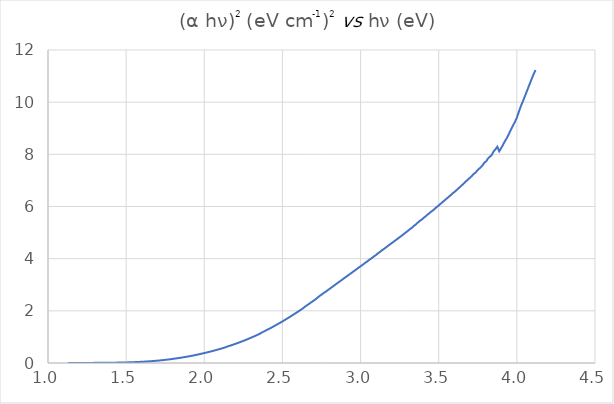
| Category | Series 0 |
|---|---|
| 1.12727 | 0.002 |
| 1.1283 | 0.002 |
| 1.12933 | 0.002 |
| 1.13036 | 0.002 |
| 1.13139 | 0.002 |
| 1.13242 | 0.002 |
| 1.13346 | 0.002 |
| 1.13449 | 0.002 |
| 1.13553 | 0.002 |
| 1.13657 | 0.002 |
| 1.13761 | 0.002 |
| 1.13866 | 0.002 |
| 1.13971 | 0.002 |
| 1.14075 | 0.002 |
| 1.1418 | 0.002 |
| 1.14286 | 0.002 |
| 1.14391 | 0.002 |
| 1.14497 | 0.002 |
| 1.14603 | 0.002 |
| 1.14709 | 0.002 |
| 1.14815 | 0.002 |
| 1.14921 | 0.002 |
| 1.15028 | 0.002 |
| 1.15135 | 0.002 |
| 1.15242 | 0.002 |
| 1.15349 | 0.002 |
| 1.15456 | 0.002 |
| 1.15564 | 0.002 |
| 1.15672 | 0.002 |
| 1.1578 | 0.002 |
| 1.15888 | 0.002 |
| 1.15996 | 0.002 |
| 1.16105 | 0.002 |
| 1.16214 | 0.002 |
| 1.16323 | 0.002 |
| 1.16432 | 0.002 |
| 1.16541 | 0.002 |
| 1.16651 | 0.002 |
| 1.16761 | 0.002 |
| 1.16871 | 0.002 |
| 1.16981 | 0.002 |
| 1.17092 | 0.002 |
| 1.17202 | 0.002 |
| 1.17313 | 0.002 |
| 1.17424 | 0.002 |
| 1.17536 | 0.002 |
| 1.17647 | 0.002 |
| 1.17759 | 0.002 |
| 1.17871 | 0.002 |
| 1.17983 | 0.002 |
| 1.18095 | 0.002 |
| 1.18208 | 0.002 |
| 1.18321 | 0.002 |
| 1.18434 | 0.002 |
| 1.18547 | 0.002 |
| 1.1866 | 0.002 |
| 1.18774 | 0.003 |
| 1.18888 | 0.003 |
| 1.19002 | 0.003 |
| 1.19116 | 0.003 |
| 1.19231 | 0.003 |
| 1.19346 | 0.003 |
| 1.19461 | 0.003 |
| 1.19576 | 0.003 |
| 1.19691 | 0.003 |
| 1.19807 | 0.003 |
| 1.19923 | 0.003 |
| 1.20039 | 0.003 |
| 1.20155 | 0.003 |
| 1.20272 | 0.003 |
| 1.20388 | 0.003 |
| 1.20505 | 0.003 |
| 1.20623 | 0.003 |
| 1.2074 | 0.003 |
| 1.20858 | 0.003 |
| 1.20976 | 0.003 |
| 1.21094 | 0.003 |
| 1.21212 | 0.003 |
| 1.21331 | 0.003 |
| 1.2145 | 0.003 |
| 1.21569 | 0.003 |
| 1.21688 | 0.003 |
| 1.21807 | 0.003 |
| 1.21927 | 0.003 |
| 1.22047 | 0.003 |
| 1.22167 | 0.003 |
| 1.22288 | 0.003 |
| 1.22409 | 0.003 |
| 1.2253 | 0.003 |
| 1.22651 | 0.003 |
| 1.22772 | 0.003 |
| 1.22894 | 0.003 |
| 1.23016 | 0.003 |
| 1.23138 | 0.003 |
| 1.2326 | 0.003 |
| 1.23383 | 0.003 |
| 1.23506 | 0.003 |
| 1.23629 | 0.003 |
| 1.23752 | 0.003 |
| 1.23876 | 0.003 |
| 1.24 | 0.003 |
| 1.24124 | 0.003 |
| 1.24248 | 0.003 |
| 1.24373 | 0.004 |
| 1.24498 | 0.004 |
| 1.24623 | 0.004 |
| 1.24748 | 0.004 |
| 1.24874 | 0.004 |
| 1.25 | 0.004 |
| 1.25126 | 0.004 |
| 1.25253 | 0.004 |
| 1.25379 | 0.004 |
| 1.25506 | 0.004 |
| 1.25633 | 0.004 |
| 1.25761 | 0.004 |
| 1.25888 | 0.004 |
| 1.26016 | 0.004 |
| 1.26144 | 0.004 |
| 1.26273 | 0.004 |
| 1.26402 | 0.004 |
| 1.26531 | 0.004 |
| 1.2666 | 0.004 |
| 1.26789 | 0.004 |
| 1.26919 | 0.004 |
| 1.27049 | 0.004 |
| 1.27179 | 0.004 |
| 1.2731 | 0.004 |
| 1.27441 | 0.004 |
| 1.27572 | 0.004 |
| 1.27703 | 0.004 |
| 1.27835 | 0.004 |
| 1.27967 | 0.004 |
| 1.28099 | 0.004 |
| 1.28232 | 0.004 |
| 1.28364 | 0.004 |
| 1.28497 | 0.005 |
| 1.28631 | 0.005 |
| 1.28764 | 0.005 |
| 1.28898 | 0.005 |
| 1.29032 | 0.005 |
| 1.29167 | 0.005 |
| 1.29301 | 0.005 |
| 1.29436 | 0.005 |
| 1.29572 | 0.005 |
| 1.29707 | 0.005 |
| 1.29843 | 0.005 |
| 1.29979 | 0.005 |
| 1.30115 | 0.005 |
| 1.30252 | 0.005 |
| 1.30389 | 0.005 |
| 1.30526 | 0.005 |
| 1.30664 | 0.005 |
| 1.30802 | 0.005 |
| 1.3094 | 0.005 |
| 1.31078 | 0.005 |
| 1.31217 | 0.005 |
| 1.31356 | 0.006 |
| 1.31495 | 0.006 |
| 1.31635 | 0.006 |
| 1.31775 | 0.006 |
| 1.31915 | 0.006 |
| 1.32055 | 0.006 |
| 1.32196 | 0.006 |
| 1.32337 | 0.006 |
| 1.32479 | 0.006 |
| 1.3262 | 0.006 |
| 1.32762 | 0.006 |
| 1.32905 | 0.006 |
| 1.33047 | 0.006 |
| 1.3319 | 0.006 |
| 1.33333 | 0.006 |
| 1.33477 | 0.006 |
| 1.33621 | 0.006 |
| 1.33765 | 0.007 |
| 1.33909 | 0.007 |
| 1.34054 | 0.007 |
| 1.34199 | 0.007 |
| 1.34345 | 0.007 |
| 1.3449 | 0.007 |
| 1.34636 | 0.007 |
| 1.34783 | 0.007 |
| 1.34929 | 0.007 |
| 1.35076 | 0.007 |
| 1.35224 | 0.007 |
| 1.35371 | 0.007 |
| 1.35519 | 0.007 |
| 1.35667 | 0.008 |
| 1.35816 | 0.008 |
| 1.35965 | 0.008 |
| 1.36114 | 0.008 |
| 1.36264 | 0.008 |
| 1.36414 | 0.008 |
| 1.36564 | 0.008 |
| 1.36714 | 0.008 |
| 1.36865 | 0.008 |
| 1.37017 | 0.008 |
| 1.37168 | 0.008 |
| 1.3732 | 0.008 |
| 1.37472 | 0.009 |
| 1.37625 | 0.009 |
| 1.37778 | 0.009 |
| 1.37931 | 0.009 |
| 1.38085 | 0.009 |
| 1.38239 | 0.009 |
| 1.38393 | 0.009 |
| 1.38547 | 0.009 |
| 1.38702 | 0.009 |
| 1.38858 | 0.01 |
| 1.39013 | 0.01 |
| 1.39169 | 0.01 |
| 1.39326 | 0.01 |
| 1.39483 | 0.01 |
| 1.3964 | 0.01 |
| 1.39797 | 0.01 |
| 1.39955 | 0.01 |
| 1.40113 | 0.01 |
| 1.40271 | 0.011 |
| 1.4043 | 0.011 |
| 1.4059 | 0.011 |
| 1.40749 | 0.011 |
| 1.40909 | 0.011 |
| 1.41069 | 0.011 |
| 1.4123 | 0.011 |
| 1.41391 | 0.011 |
| 1.41553 | 0.012 |
| 1.41714 | 0.012 |
| 1.41876 | 0.012 |
| 1.42039 | 0.012 |
| 1.42202 | 0.012 |
| 1.42365 | 0.012 |
| 1.42529 | 0.013 |
| 1.42693 | 0.013 |
| 1.42857 | 0.013 |
| 1.43022 | 0.013 |
| 1.43187 | 0.013 |
| 1.43353 | 0.013 |
| 1.43519 | 0.014 |
| 1.43685 | 0.014 |
| 1.43852 | 0.014 |
| 1.44019 | 0.014 |
| 1.44186 | 0.014 |
| 1.44354 | 0.014 |
| 1.44522 | 0.015 |
| 1.44691 | 0.015 |
| 1.4486 | 0.015 |
| 1.45029 | 0.015 |
| 1.45199 | 0.015 |
| 1.45369 | 0.016 |
| 1.4554 | 0.016 |
| 1.45711 | 0.016 |
| 1.45882 | 0.016 |
| 1.46054 | 0.016 |
| 1.46226 | 0.017 |
| 1.46399 | 0.017 |
| 1.46572 | 0.017 |
| 1.46746 | 0.017 |
| 1.46919 | 0.018 |
| 1.47094 | 0.018 |
| 1.47268 | 0.018 |
| 1.47444 | 0.018 |
| 1.47619 | 0.018 |
| 1.47795 | 0.019 |
| 1.47971 | 0.019 |
| 1.48148 | 0.019 |
| 1.48325 | 0.02 |
| 1.48503 | 0.02 |
| 1.48681 | 0.02 |
| 1.4886 | 0.021 |
| 1.49038 | 0.021 |
| 1.49218 | 0.021 |
| 1.49398 | 0.021 |
| 1.49578 | 0.022 |
| 1.49758 | 0.022 |
| 1.4994 | 0.022 |
| 1.50121 | 0.023 |
| 1.50303 | 0.023 |
| 1.50485 | 0.023 |
| 1.50668 | 0.023 |
| 1.50852 | 0.024 |
| 1.51035 | 0.024 |
| 1.5122 | 0.024 |
| 1.51404 | 0.025 |
| 1.51589 | 0.025 |
| 1.51775 | 0.025 |
| 1.51961 | 0.026 |
| 1.52147 | 0.026 |
| 1.52334 | 0.026 |
| 1.52522 | 0.027 |
| 1.52709 | 0.027 |
| 1.52898 | 0.028 |
| 1.53086 | 0.028 |
| 1.53276 | 0.029 |
| 1.53465 | 0.029 |
| 1.53656 | 0.029 |
| 1.53846 | 0.03 |
| 1.54037 | 0.03 |
| 1.54229 | 0.031 |
| 1.54421 | 0.031 |
| 1.54613 | 0.032 |
| 1.54806 | 0.032 |
| 1.55 | 0.032 |
| 1.55194 | 0.033 |
| 1.55388 | 0.033 |
| 1.55583 | 0.034 |
| 1.55779 | 0.034 |
| 1.55975 | 0.035 |
| 1.56171 | 0.035 |
| 1.56368 | 0.036 |
| 1.56566 | 0.036 |
| 1.56764 | 0.037 |
| 1.56962 | 0.037 |
| 1.57161 | 0.038 |
| 1.5736 | 0.039 |
| 1.5756 | 0.039 |
| 1.57761 | 0.04 |
| 1.57962 | 0.04 |
| 1.58163 | 0.041 |
| 1.58365 | 0.041 |
| 1.58568 | 0.042 |
| 1.58771 | 0.043 |
| 1.58974 | 0.043 |
| 1.59178 | 0.044 |
| 1.59383 | 0.044 |
| 1.59588 | 0.045 |
| 1.59794 | 0.046 |
| 1.6 | 0.046 |
| 1.60207 | 0.047 |
| 1.60414 | 0.048 |
| 1.60622 | 0.048 |
| 1.6083 | 0.049 |
| 1.61039 | 0.05 |
| 1.61248 | 0.051 |
| 1.61458 | 0.051 |
| 1.61669 | 0.052 |
| 1.6188 | 0.053 |
| 1.62092 | 0.054 |
| 1.62304 | 0.054 |
| 1.62516 | 0.055 |
| 1.6273 | 0.056 |
| 1.62943 | 0.057 |
| 1.63158 | 0.058 |
| 1.63373 | 0.058 |
| 1.63588 | 0.059 |
| 1.63804 | 0.06 |
| 1.64021 | 0.061 |
| 1.64238 | 0.062 |
| 1.64456 | 0.063 |
| 1.64675 | 0.064 |
| 1.64894 | 0.065 |
| 1.65113 | 0.066 |
| 1.65333 | 0.067 |
| 1.65554 | 0.068 |
| 1.65775 | 0.069 |
| 1.65997 | 0.07 |
| 1.6622 | 0.071 |
| 1.66443 | 0.072 |
| 1.66667 | 0.073 |
| 1.66891 | 0.074 |
| 1.67116 | 0.075 |
| 1.67341 | 0.076 |
| 1.67568 | 0.077 |
| 1.67794 | 0.079 |
| 1.68022 | 0.08 |
| 1.6825 | 0.081 |
| 1.68478 | 0.082 |
| 1.68707 | 0.083 |
| 1.68937 | 0.084 |
| 1.69168 | 0.086 |
| 1.69399 | 0.087 |
| 1.69631 | 0.088 |
| 1.69863 | 0.089 |
| 1.70096 | 0.091 |
| 1.7033 | 0.092 |
| 1.70564 | 0.093 |
| 1.70799 | 0.094 |
| 1.71034 | 0.096 |
| 1.71271 | 0.097 |
| 1.71508 | 0.099 |
| 1.71745 | 0.1 |
| 1.71983 | 0.101 |
| 1.72222 | 0.103 |
| 1.72462 | 0.104 |
| 1.72702 | 0.106 |
| 1.72943 | 0.107 |
| 1.73184 | 0.109 |
| 1.73427 | 0.11 |
| 1.73669 | 0.112 |
| 1.73913 | 0.113 |
| 1.74157 | 0.115 |
| 1.74402 | 0.116 |
| 1.74648 | 0.118 |
| 1.74894 | 0.12 |
| 1.75141 | 0.121 |
| 1.75389 | 0.123 |
| 1.75637 | 0.125 |
| 1.75887 | 0.126 |
| 1.76136 | 0.128 |
| 1.76387 | 0.13 |
| 1.76638 | 0.132 |
| 1.7689 | 0.133 |
| 1.77143 | 0.135 |
| 1.77396 | 0.137 |
| 1.7765 | 0.139 |
| 1.77905 | 0.141 |
| 1.78161 | 0.143 |
| 1.78417 | 0.145 |
| 1.78674 | 0.147 |
| 1.78932 | 0.149 |
| 1.79191 | 0.151 |
| 1.7945 | 0.153 |
| 1.7971 | 0.156 |
| 1.79971 | 0.159 |
| 1.80233 | 0.161 |
| 1.80495 | 0.163 |
| 1.80758 | 0.165 |
| 1.81022 | 0.167 |
| 1.81287 | 0.17 |
| 1.81552 | 0.172 |
| 1.81818 | 0.174 |
| 1.82085 | 0.176 |
| 1.82353 | 0.179 |
| 1.82622 | 0.181 |
| 1.82891 | 0.184 |
| 1.83161 | 0.186 |
| 1.83432 | 0.188 |
| 1.83704 | 0.191 |
| 1.83976 | 0.193 |
| 1.8425 | 0.196 |
| 1.84524 | 0.198 |
| 1.84799 | 0.201 |
| 1.85075 | 0.203 |
| 1.85351 | 0.206 |
| 1.85629 | 0.209 |
| 1.85907 | 0.211 |
| 1.86186 | 0.214 |
| 1.86466 | 0.217 |
| 1.86747 | 0.22 |
| 1.87029 | 0.222 |
| 1.87311 | 0.225 |
| 1.87595 | 0.228 |
| 1.87879 | 0.231 |
| 1.88164 | 0.234 |
| 1.8845 | 0.237 |
| 1.88737 | 0.24 |
| 1.89024 | 0.243 |
| 1.89313 | 0.246 |
| 1.89602 | 0.25 |
| 1.89893 | 0.253 |
| 1.90184 | 0.256 |
| 1.90476 | 0.259 |
| 1.90769 | 0.262 |
| 1.91063 | 0.266 |
| 1.91358 | 0.269 |
| 1.91654 | 0.272 |
| 1.9195 | 0.276 |
| 1.92248 | 0.279 |
| 1.92547 | 0.282 |
| 1.92846 | 0.286 |
| 1.93146 | 0.289 |
| 1.93448 | 0.293 |
| 1.9375 | 0.297 |
| 1.94053 | 0.3 |
| 1.94357 | 0.304 |
| 1.94662 | 0.308 |
| 1.94969 | 0.312 |
| 1.95276 | 0.315 |
| 1.95584 | 0.322 |
| 1.95893 | 0.326 |
| 1.96203 | 0.33 |
| 1.96513 | 0.334 |
| 1.96825 | 0.338 |
| 1.97138 | 0.342 |
| 1.97452 | 0.346 |
| 1.97767 | 0.351 |
| 1.98083 | 0.355 |
| 1.984 | 0.359 |
| 1.98718 | 0.363 |
| 1.99037 | 0.368 |
| 1.99357 | 0.372 |
| 1.99678 | 0.377 |
| 2.0 | 0.381 |
| 2.00323 | 0.386 |
| 2.00647 | 0.39 |
| 2.00972 | 0.395 |
| 2.01299 | 0.4 |
| 2.01626 | 0.404 |
| 2.01954 | 0.409 |
| 2.02284 | 0.414 |
| 2.02614 | 0.419 |
| 2.02946 | 0.424 |
| 2.03279 | 0.429 |
| 2.03612 | 0.434 |
| 2.03947 | 0.439 |
| 2.04283 | 0.444 |
| 2.0462 | 0.449 |
| 2.04959 | 0.455 |
| 2.05298 | 0.46 |
| 2.05638 | 0.465 |
| 2.0598 | 0.471 |
| 2.06323 | 0.476 |
| 2.06667 | 0.482 |
| 2.07012 | 0.488 |
| 2.07358 | 0.493 |
| 2.07705 | 0.499 |
| 2.08054 | 0.505 |
| 2.08403 | 0.511 |
| 2.08754 | 0.517 |
| 2.09106 | 0.523 |
| 2.09459 | 0.529 |
| 2.09814 | 0.535 |
| 2.10169 | 0.541 |
| 2.10526 | 0.547 |
| 2.10884 | 0.553 |
| 2.11244 | 0.56 |
| 2.11604 | 0.566 |
| 2.11966 | 0.572 |
| 2.12329 | 0.579 |
| 2.12693 | 0.586 |
| 2.13058 | 0.592 |
| 2.13425 | 0.599 |
| 2.13793 | 0.607 |
| 2.14162 | 0.618 |
| 2.14533 | 0.626 |
| 2.14905 | 0.633 |
| 2.15278 | 0.64 |
| 2.15652 | 0.647 |
| 2.16028 | 0.655 |
| 2.16405 | 0.662 |
| 2.16783 | 0.67 |
| 2.17163 | 0.677 |
| 2.17544 | 0.685 |
| 2.17926 | 0.693 |
| 2.1831 | 0.701 |
| 2.18695 | 0.709 |
| 2.19081 | 0.717 |
| 2.19469 | 0.725 |
| 2.19858 | 0.734 |
| 2.20249 | 0.742 |
| 2.20641 | 0.75 |
| 2.21034 | 0.759 |
| 2.21429 | 0.767 |
| 2.21825 | 0.776 |
| 2.22222 | 0.784 |
| 2.22621 | 0.794 |
| 2.23022 | 0.803 |
| 2.23423 | 0.812 |
| 2.23827 | 0.821 |
| 2.24231 | 0.83 |
| 2.24638 | 0.84 |
| 2.25045 | 0.849 |
| 2.25455 | 0.859 |
| 2.25865 | 0.869 |
| 2.26277 | 0.879 |
| 2.26691 | 0.888 |
| 2.27106 | 0.899 |
| 2.27523 | 0.909 |
| 2.27941 | 0.919 |
| 2.28361 | 0.93 |
| 2.28782 | 0.941 |
| 2.29205 | 0.951 |
| 2.2963 | 0.962 |
| 2.30056 | 0.973 |
| 2.30483 | 0.984 |
| 2.30912 | 0.995 |
| 2.31343 | 1.007 |
| 2.31776 | 1.018 |
| 2.3221 | 1.03 |
| 2.32645 | 1.042 |
| 2.33083 | 1.053 |
| 2.33522 | 1.065 |
| 2.33962 | 1.077 |
| 2.34405 | 1.09 |
| 2.34848 | 1.103 |
| 2.35294 | 1.115 |
| 2.35741 | 1.128 |
| 2.3619 | 1.146 |
| 2.36641 | 1.163 |
| 2.37094 | 1.177 |
| 2.37548 | 1.19 |
| 2.38004 | 1.204 |
| 2.38462 | 1.218 |
| 2.38921 | 1.231 |
| 2.39382 | 1.245 |
| 2.39845 | 1.259 |
| 2.4031 | 1.274 |
| 2.40777 | 1.288 |
| 2.41245 | 1.302 |
| 2.41715 | 1.317 |
| 2.42188 | 1.332 |
| 2.42661 | 1.347 |
| 2.43137 | 1.363 |
| 2.43615 | 1.379 |
| 2.44094 | 1.394 |
| 2.44576 | 1.41 |
| 2.45059 | 1.427 |
| 2.45545 | 1.443 |
| 2.46032 | 1.459 |
| 2.46521 | 1.475 |
| 2.47012 | 1.492 |
| 2.47505 | 1.508 |
| 2.48 | 1.525 |
| 2.48497 | 1.542 |
| 2.48996 | 1.56 |
| 2.49497 | 1.577 |
| 2.5 | 1.594 |
| 2.50505 | 1.612 |
| 2.51012 | 1.63 |
| 2.51521 | 1.65 |
| 2.52033 | 1.668 |
| 2.52546 | 1.687 |
| 2.53061 | 1.706 |
| 2.53579 | 1.725 |
| 2.54098 | 1.744 |
| 2.5462 | 1.764 |
| 2.55144 | 1.783 |
| 2.5567 | 1.803 |
| 2.56198 | 1.824 |
| 2.56729 | 1.844 |
| 2.57261 | 1.865 |
| 2.57796 | 1.884 |
| 2.58333 | 1.906 |
| 2.58873 | 1.926 |
| 2.59414 | 1.947 |
| 2.59958 | 1.969 |
| 2.60504 | 1.99 |
| 2.61053 | 2.012 |
| 2.61603 | 2.034 |
| 2.62156 | 2.055 |
| 2.62712 | 2.077 |
| 2.6327 | 2.101 |
| 2.6383 | 2.123 |
| 2.64392 | 2.157 |
| 2.64957 | 2.181 |
| 2.65525 | 2.205 |
| 2.66094 | 2.228 |
| 2.66667 | 2.252 |
| 2.67241 | 2.276 |
| 2.67819 | 2.301 |
| 2.68398 | 2.325 |
| 2.6898 | 2.349 |
| 2.69565 | 2.374 |
| 2.70153 | 2.398 |
| 2.70742 | 2.423 |
| 2.71335 | 2.449 |
| 2.7193 | 2.475 |
| 2.72527 | 2.507 |
| 2.73128 | 2.541 |
| 2.73731 | 2.567 |
| 2.74336 | 2.594 |
| 2.74945 | 2.619 |
| 2.75556 | 2.645 |
| 2.76169 | 2.673 |
| 2.76786 | 2.698 |
| 2.77405 | 2.724 |
| 2.78027 | 2.75 |
| 2.78652 | 2.777 |
| 2.79279 | 2.804 |
| 2.7991 | 2.831 |
| 2.80543 | 2.859 |
| 2.81179 | 2.887 |
| 2.81818 | 2.915 |
| 2.8246 | 2.943 |
| 2.83105 | 2.972 |
| 2.83753 | 3.002 |
| 2.84404 | 3.03 |
| 2.85057 | 3.057 |
| 2.85714 | 3.085 |
| 2.86374 | 3.114 |
| 2.87037 | 3.142 |
| 2.87703 | 3.172 |
| 2.88372 | 3.2 |
| 2.89044 | 3.23 |
| 2.8972 | 3.262 |
| 2.90398 | 3.29 |
| 2.9108 | 3.319 |
| 2.91765 | 3.349 |
| 2.92453 | 3.379 |
| 2.93144 | 3.408 |
| 2.93839 | 3.44 |
| 2.94537 | 3.468 |
| 2.95238 | 3.501 |
| 2.95943 | 3.532 |
| 2.96651 | 3.561 |
| 2.97362 | 3.593 |
| 2.98077 | 3.625 |
| 2.98795 | 3.656 |
| 2.99517 | 3.686 |
| 3.00242 | 3.718 |
| 3.00971 | 3.751 |
| 3.01703 | 3.783 |
| 3.02439 | 3.815 |
| 3.03178 | 3.849 |
| 3.03922 | 3.878 |
| 3.04668 | 3.914 |
| 3.05419 | 3.947 |
| 3.06173 | 3.981 |
| 3.06931 | 4.011 |
| 3.07692 | 4.047 |
| 3.08458 | 4.081 |
| 3.09227 | 4.114 |
| 3.1 | 4.146 |
| 3.10777 | 4.189 |
| 3.11558 | 4.223 |
| 3.12343 | 4.256 |
| 3.13131 | 4.294 |
| 3.13924 | 4.329 |
| 3.14721 | 4.363 |
| 3.15522 | 4.399 |
| 3.16327 | 4.436 |
| 3.17136 | 4.471 |
| 3.17949 | 4.508 |
| 3.18766 | 4.544 |
| 3.19588 | 4.582 |
| 3.20413 | 4.617 |
| 3.21244 | 4.655 |
| 3.22078 | 4.69 |
| 3.22917 | 4.729 |
| 3.2376 | 4.766 |
| 3.24607 | 4.807 |
| 3.25459 | 4.841 |
| 3.26316 | 4.882 |
| 3.27177 | 4.921 |
| 3.28042 | 4.964 |
| 3.28912 | 5.001 |
| 3.29787 | 5.044 |
| 3.30667 | 5.085 |
| 3.31551 | 5.132 |
| 3.3244 | 5.169 |
| 3.33333 | 5.211 |
| 3.34232 | 5.261 |
| 3.35135 | 5.299 |
| 3.36043 | 5.357 |
| 3.36957 | 5.4 |
| 3.37875 | 5.447 |
| 3.38798 | 5.485 |
| 3.39726 | 5.528 |
| 3.40659 | 5.579 |
| 3.41598 | 5.622 |
| 3.42541 | 5.674 |
| 3.4349 | 5.719 |
| 3.44444 | 5.767 |
| 3.45404 | 5.811 |
| 3.46369 | 5.853 |
| 3.47339 | 5.904 |
| 3.48315 | 5.96 |
| 3.49296 | 6.007 |
| 3.50282 | 6.055 |
| 3.51275 | 6.106 |
| 3.52273 | 6.161 |
| 3.53276 | 6.211 |
| 3.54286 | 6.262 |
| 3.55301 | 6.313 |
| 3.56322 | 6.367 |
| 3.57349 | 6.418 |
| 3.58382 | 6.474 |
| 3.5942 | 6.527 |
| 3.60465 | 6.577 |
| 3.61516 | 6.634 |
| 3.62573 | 6.694 |
| 3.63636 | 6.746 |
| 3.64706 | 6.811 |
| 3.65782 | 6.867 |
| 3.66864 | 6.936 |
| 3.67953 | 6.991 |
| 3.69048 | 7.054 |
| 3.70149 | 7.11 |
| 3.71257 | 7.172 |
| 3.72372 | 7.248 |
| 3.73494 | 7.296 |
| 3.74622 | 7.375 |
| 3.75758 | 7.443 |
| 3.769 | 7.504 |
| 3.78049 | 7.578 |
| 3.79205 | 7.681 |
| 3.80368 | 7.731 |
| 3.81538 | 7.843 |
| 3.82716 | 7.907 |
| 3.83901 | 7.974 |
| 3.85093 | 8.108 |
| 3.86293 | 8.191 |
| 3.875 | 8.292 |
| 3.88715 | 8.117 |
| 3.89937 | 8.234 |
| 3.91167 | 8.37 |
| 3.92405 | 8.509 |
| 3.93651 | 8.633 |
| 3.94904 | 8.781 |
| 3.96166 | 8.945 |
| 3.97436 | 9.092 |
| 3.98714 | 9.239 |
| 4.0 | 9.403 |
| 4.01294 | 9.633 |
| 4.02597 | 9.853 |
| 4.03909 | 10.039 |
| 4.05229 | 10.242 |
| 4.06557 | 10.443 |
| 4.07895 | 10.65 |
| 4.09241 | 10.857 |
| 4.10596 | 11.055 |
| 4.1196 | 11.233 |